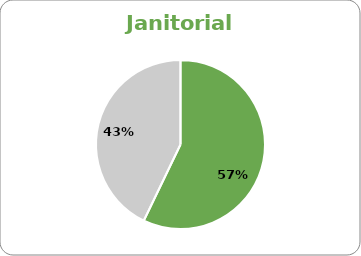
| Category | Series 0 |
|---|---|
| Sub-Total EPP | 12 |
| Sub-Total Non EPP | 9 |